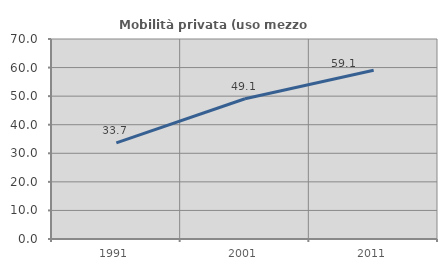
| Category | Mobilità privata (uso mezzo privato) |
|---|---|
| 1991.0 | 33.661 |
| 2001.0 | 49.092 |
| 2011.0 | 59.068 |